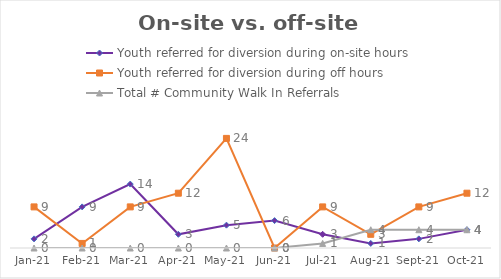
| Category | Youth referred for diversion during on-site hours | Youth referred for diversion during off hours | Total # Community Walk In Referrals |
|---|---|---|---|
| 2021-01-01 | 2 | 9 | 0 |
| 2021-02-01 | 9 | 1 | 0 |
| 2021-03-01 | 14 | 9 | 0 |
| 2021-04-01 | 3 | 12 | 0 |
| 2021-05-01 | 5 | 24 | 0 |
| 2021-06-01 | 6 | 0 | 0 |
| 2021-07-01 | 3 | 9 | 1 |
| 2021-08-01 | 1 | 3 | 4 |
| 2021-09-01 | 2 | 9 | 4 |
| 2021-10-01 | 4 | 12 | 4 |